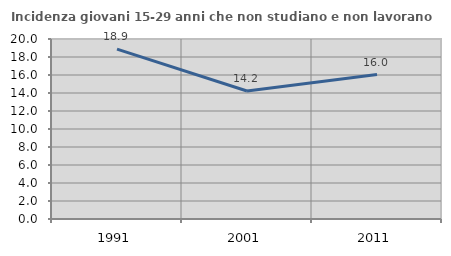
| Category | Incidenza giovani 15-29 anni che non studiano e non lavorano  |
|---|---|
| 1991.0 | 18.868 |
| 2001.0 | 14.22 |
| 2011.0 | 16.049 |